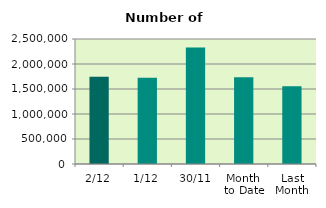
| Category | Series 0 |
|---|---|
| 2/12 | 1743558 |
| 1/12 | 1724046 |
| 30/11 | 2328666 |
| Month 
to Date | 1733802 |
| Last
Month | 1553278.182 |